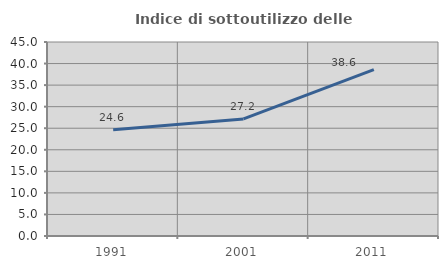
| Category | Indice di sottoutilizzo delle abitazioni  |
|---|---|
| 1991.0 | 24.648 |
| 2001.0 | 27.16 |
| 2011.0 | 38.608 |